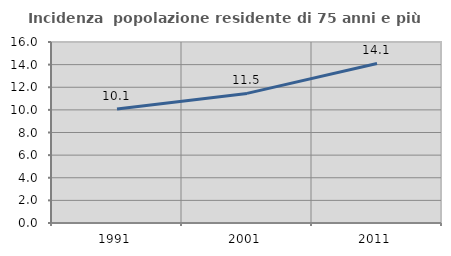
| Category | Incidenza  popolazione residente di 75 anni e più |
|---|---|
| 1991.0 | 10.086 |
| 2001.0 | 11.456 |
| 2011.0 | 14.107 |